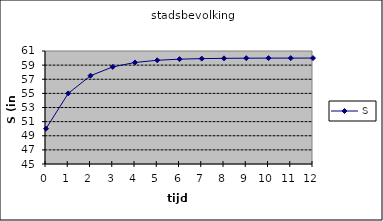
| Category | S |
|---|---|
| 0.0 | 50 |
| 1.0 | 55 |
| 2.0 | 57.5 |
| 3.0 | 58.75 |
| 4.0 | 59.375 |
| 5.0 | 59.688 |
| 6.0 | 59.844 |
| 7.0 | 59.922 |
| 8.0 | 59.961 |
| 9.0 | 59.98 |
| 10.0 | 59.99 |
| 11.0 | 59.995 |
| 12.0 | 59.998 |